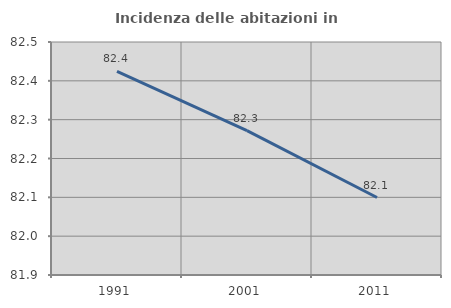
| Category | Incidenza delle abitazioni in proprietà  |
|---|---|
| 1991.0 | 82.424 |
| 2001.0 | 82.272 |
| 2011.0 | 82.099 |